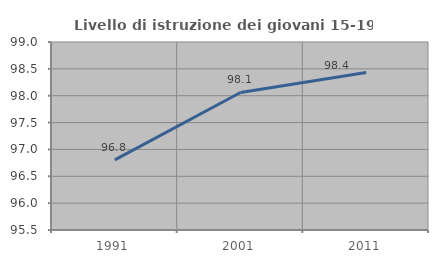
| Category | Livello di istruzione dei giovani 15-19 anni |
|---|---|
| 1991.0 | 96.806 |
| 2001.0 | 98.06 |
| 2011.0 | 98.431 |